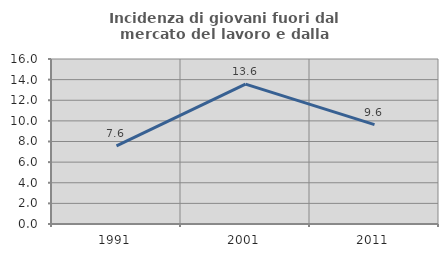
| Category | Incidenza di giovani fuori dal mercato del lavoro e dalla formazione  |
|---|---|
| 1991.0 | 7.57 |
| 2001.0 | 13.568 |
| 2011.0 | 9.639 |